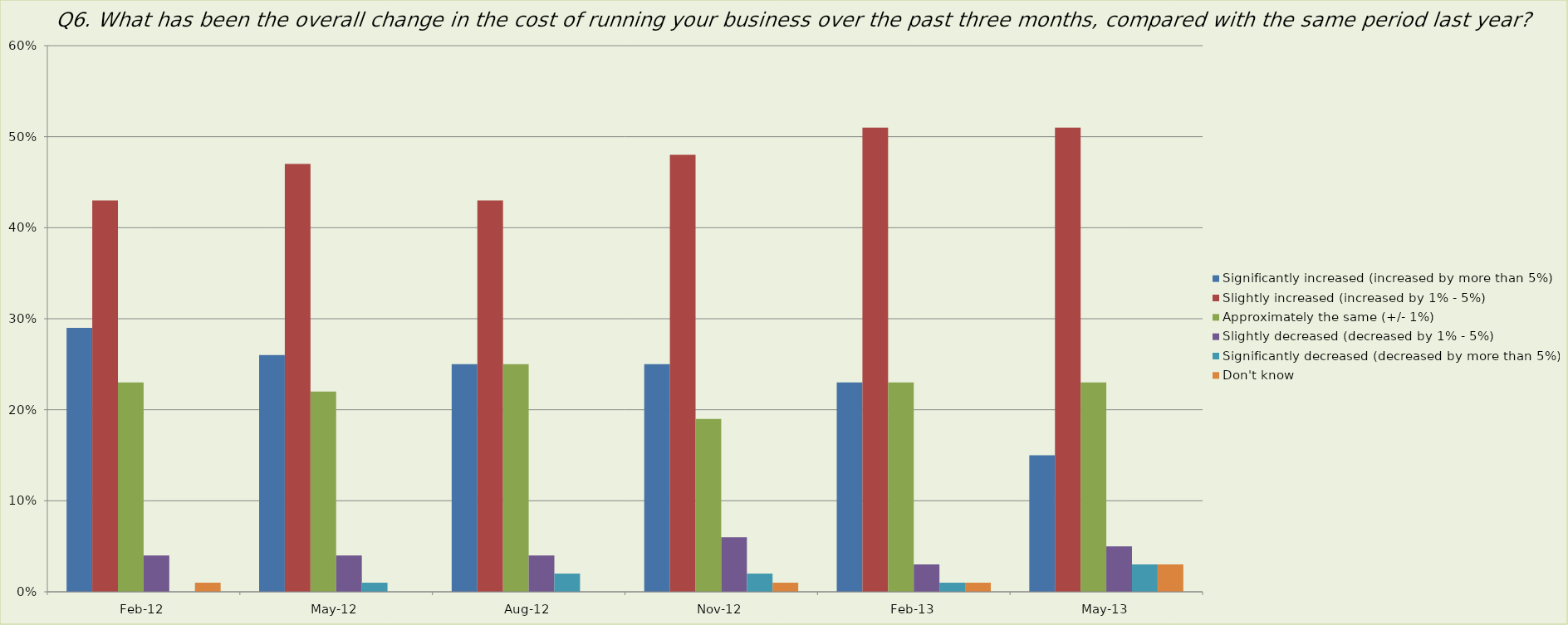
| Category | Significantly increased (increased by more than 5%) | Slightly increased (increased by 1% - 5%) | Approximately the same (+/- 1%) | Slightly decreased (decreased by 1% - 5%) | Significantly decreased (decreased by more than 5%) | Don't know |
|---|---|---|---|---|---|---|
| 2012-02-01 | 0.29 | 0.43 | 0.23 | 0.04 | 0 | 0.01 |
| 2012-05-01 | 0.26 | 0.47 | 0.22 | 0.04 | 0.01 | 0 |
| 2012-08-01 | 0.25 | 0.43 | 0.25 | 0.04 | 0.02 | 0 |
| 2012-11-01 | 0.25 | 0.48 | 0.19 | 0.06 | 0.02 | 0.01 |
| 2013-02-01 | 0.23 | 0.51 | 0.23 | 0.03 | 0.01 | 0.01 |
| 2013-05-01 | 0.15 | 0.51 | 0.23 | 0.05 | 0.03 | 0.03 |